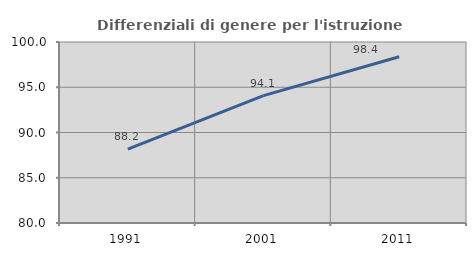
| Category | Differenziali di genere per l'istruzione superiore |
|---|---|
| 1991.0 | 88.163 |
| 2001.0 | 94.078 |
| 2011.0 | 98.369 |